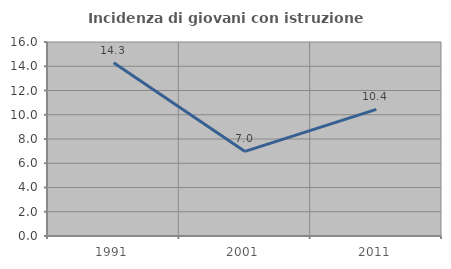
| Category | Incidenza di giovani con istruzione universitaria |
|---|---|
| 1991.0 | 14.286 |
| 2001.0 | 6.977 |
| 2011.0 | 10.448 |